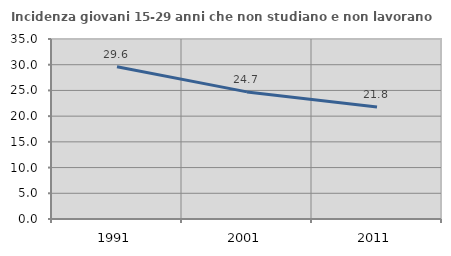
| Category | Incidenza giovani 15-29 anni che non studiano e non lavorano  |
|---|---|
| 1991.0 | 29.609 |
| 2001.0 | 24.716 |
| 2011.0 | 21.799 |